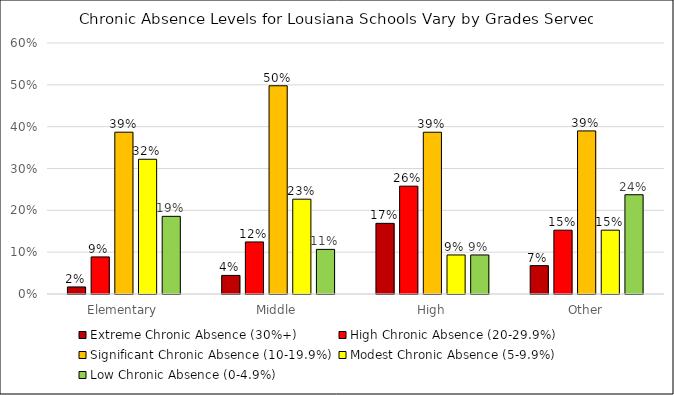
| Category | Extreme Chronic Absence (30%+) | High Chronic Absence (20-29.9%) | Significant Chronic Absence (10-19.9%) | Modest Chronic Absence (5-9.9%) | Low Chronic Absence (0-4.9%) |
|---|---|---|---|---|---|
| Elementary | 0.017 | 0.089 | 0.387 | 0.322 | 0.186 |
| Middle | 0.044 | 0.124 | 0.498 | 0.227 | 0.107 |
| High | 0.169 | 0.258 | 0.387 | 0.093 | 0.093 |
| Other | 0.068 | 0.153 | 0.39 | 0.153 | 0.237 |